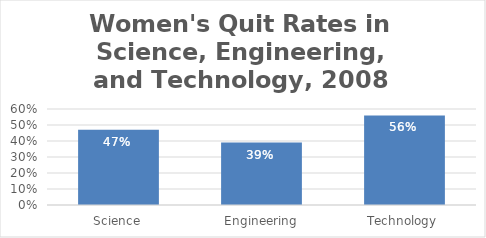
| Category | Percent of Women Who Quit |
|---|---|
| Science | 0.47 |
| Engineering | 0.39 |
| Technology | 0.56 |